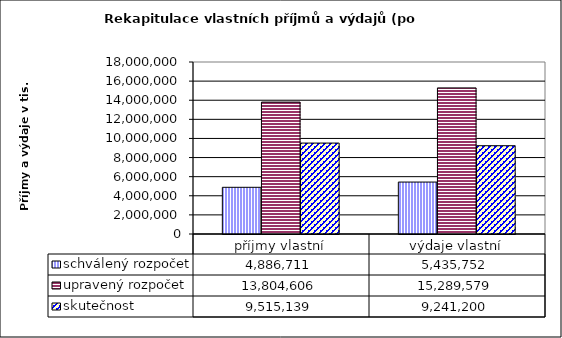
| Category | schválený rozpočet | upravený rozpočet | skutečnost |
|---|---|---|---|
| příjmy vlastní | 4886711 | 13804606 | 9515139 |
| výdaje vlastní | 5435752 | 15289579 | 9241200 |